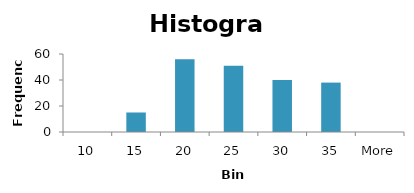
| Category | Frequency |
|---|---|
| 10 | 0 |
| 15 | 15 |
| 20 | 56 |
| 25 | 51 |
| 30 | 40 |
| 35 | 38 |
| More | 0 |